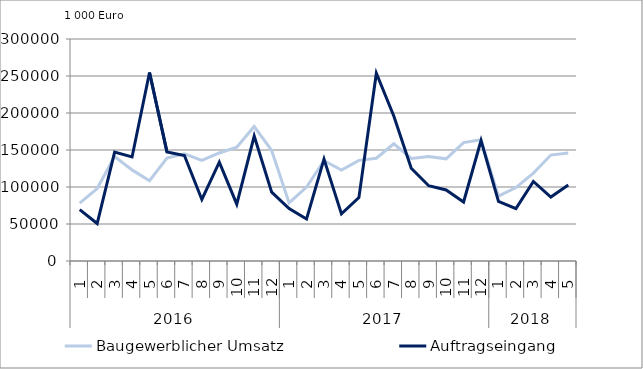
| Category | Baugewerblicher Umsatz | Auftragseingang |
|---|---|---|
| 0 | 78291.738 | 69470.357 |
| 1 | 97863.379 | 50640.033 |
| 2 | 141176.119 | 147206.65 |
| 3 | 123121.297 | 140579.009 |
| 4 | 108561.124 | 254739.334 |
| 5 | 139030.209 | 147481.644 |
| 6 | 144784.416 | 142609.658 |
| 7 | 135870.195 | 83192.156 |
| 8 | 145961.738 | 133594.351 |
| 9 | 153886.826 | 76793.838 |
| 10 | 181740.037 | 168867.568 |
| 11 | 149348.138 | 93011.853 |
| 12 | 78446.78 | 70908.903 |
| 13 | 99841.908 | 56868.408 |
| 14 | 135679.867 | 137790.423 |
| 15 | 123004.403 | 63637.761 |
| 16 | 136010.071 | 85644.63 |
| 17 | 138859.308 | 253791.552 |
| 18 | 158353.879 | 196034.198 |
| 19 | 138510.315 | 125319.873 |
| 20 | 141109.925 | 101690.626 |
| 21 | 138067.098 | 95966.626 |
| 22 | 160064.454 | 79701.993 |
| 23 | 163969.017 | 162878.607 |
| 24 | 87640.529 | 80684.627 |
| 25 | 99259.455 | 70746.763 |
| 26 | 118764.324 | 107538.747 |
| 27 | 143144.178 | 86374.619 |
| 28 | 146070.782 | 102661.329 |